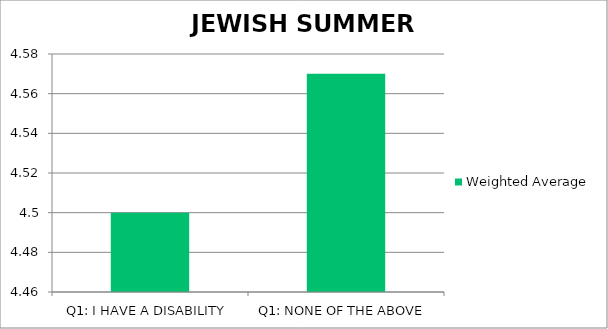
| Category | Weighted Average |
|---|---|
| Q1: I HAVE A DISABILITY | 4.5 |
| Q1: NONE OF THE ABOVE | 4.57 |